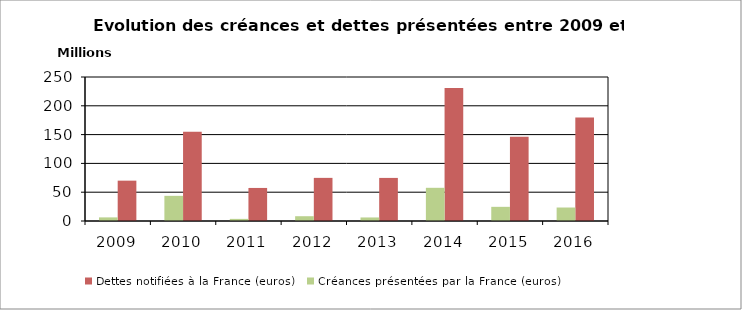
| Category | Dettes notifiées à la France (euros) | Créances présentées par la France (euros) |
|---|---|---|
| 2016.0 | 179868334.343 | 23413866.759 |
| 2015.0 | 146430414.381 | 24588014.453 |
| 2014.0 | 231114353.19 | 57629490.71 |
| 2013.0 | 74799596.08 | 6149379.76 |
| 2012.0 | 74871215.89 | 8314238.35 |
| 2011.0 | 57380791.53 | 3684702.18 |
| 2010.0 | 155114308.61 | 43668649.27 |
| 2009.0 | 70047876.86 | 6269892.13 |